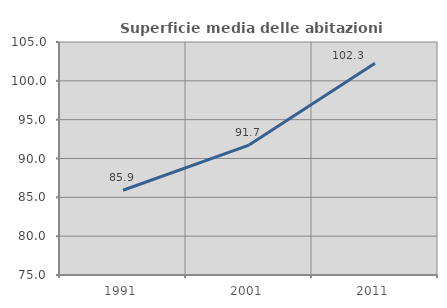
| Category | Superficie media delle abitazioni occupate |
|---|---|
| 1991.0 | 85.91 |
| 2001.0 | 91.73 |
| 2011.0 | 102.259 |